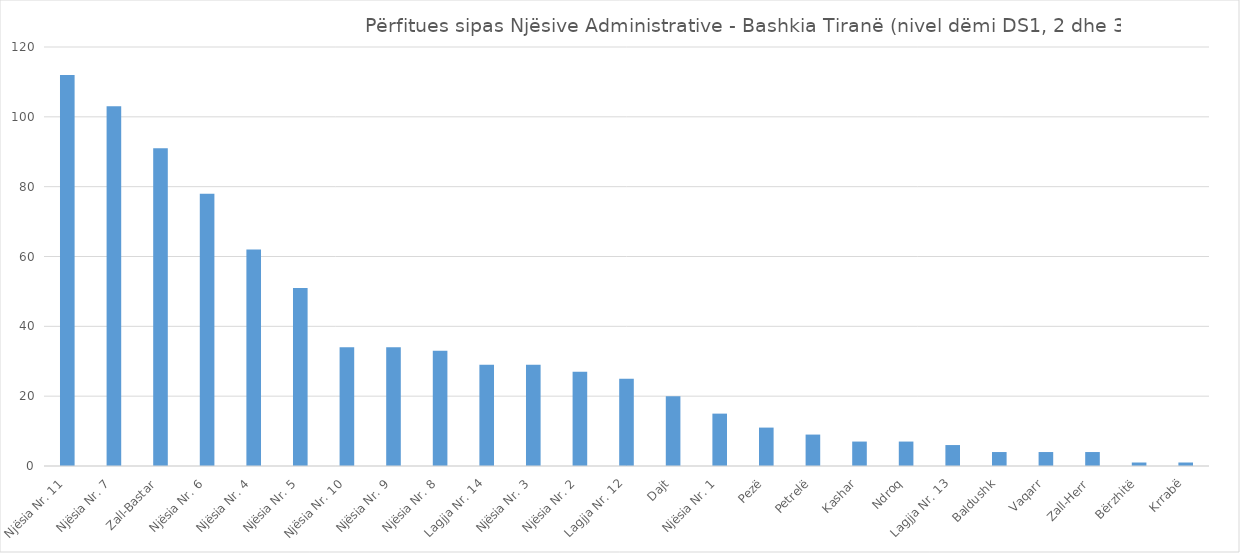
| Category | Nr. i Subjekteve Përfitues |
|---|---|
| Njësia Nr. 11 | 112 |
| Njësia Nr. 7 | 103 |
| Zall-Bastar | 91 |
| Njësia Nr. 6 | 78 |
| Njësia Nr. 4 | 62 |
| Njësia Nr. 5 | 51 |
| Njësia Nr. 10 | 34 |
| Njësia Nr. 9 | 34 |
| Njësia Nr. 8 | 33 |
| Lagjja Nr. 14 | 29 |
| Njësia Nr. 3 | 29 |
| Njësia Nr. 2 | 27 |
| Lagjja Nr. 12 | 25 |
| Dajt | 20 |
| Njësia Nr. 1 | 15 |
| Pezë | 11 |
| Petrelë | 9 |
| Kashar | 7 |
| Ndroq | 7 |
| Lagjja Nr. 13 | 6 |
| Baldushk | 4 |
| Vaqarr | 4 |
| Zall-Herr | 4 |
| Bërzhitë | 1 |
| Krrabë | 1 |